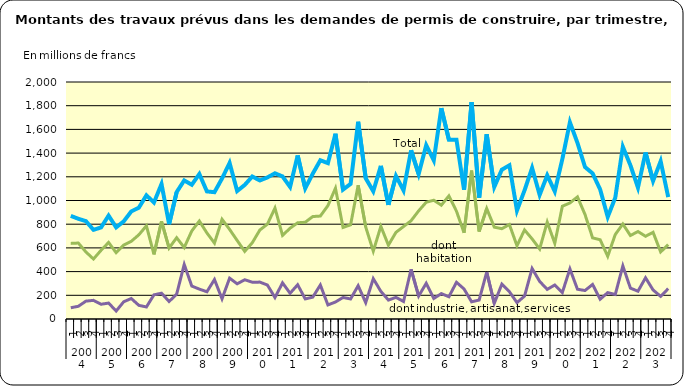
| Category | Series 1 | Series 2 | Series 3 |
|---|---|---|---|
| 0 | 870.242 | 638.031 | 95.061 |
| 1 | 845.656 | 640.955 | 107.34 |
| 2 | 825.743 | 565.77 | 150.775 |
| 3 | 752.519 | 506.261 | 157.418 |
| 4 | 772.617 | 579.57 | 124.318 |
| 5 | 872.366 | 645.941 | 134.593 |
| 6 | 773.108 | 559.38 | 67.48 |
| 7 | 823.981 | 623.879 | 145.563 |
| 8 | 907.879 | 655.638 | 172.873 |
| 9 | 939.543 | 710.541 | 115.256 |
| 10 | 1043.355 | 786.548 | 101.517 |
| 11 | 983.172 | 544.821 | 203.904 |
| 12 | 1139.55 | 823.637 | 217.726 |
| 13 | 800.652 | 598.716 | 147.707 |
| 14 | 1070.917 | 685.929 | 209.934 |
| 15 | 1169.397 | 603.176 | 460.364 |
| 16 | 1132.9 | 743.175 | 277.939 |
| 17 | 1223.557 | 826.96 | 252.245 |
| 18 | 1076.699 | 726.08 | 229.862 |
| 19 | 1070.102 | 640.651 | 333.224 |
| 20 | 1185.684 | 841.14 | 170.224 |
| 21 | 1317.119 | 756.055 | 344.642 |
| 22 | 1079.917 | 662.773 | 296.944 |
| 23 | 1131.164 | 570.731 | 331.21 |
| 24 | 1202.585 | 643.383 | 310.77 |
| 25 | 1169.048 | 750.936 | 311.246 |
| 26 | 1194.768 | 800.467 | 286.719 |
| 27 | 1229.594 | 936.046 | 181.05 |
| 28 | 1203.136 | 705.619 | 304.852 |
| 29 | 1114.431 | 766.27 | 217.028 |
| 30 | 1380.327 | 811.945 | 289.083 |
| 31 | 1102.628 | 816.388 | 169.409 |
| 32 | 1226.569 | 864.557 | 184.336 |
| 33 | 1339.612 | 868.792 | 287.11 |
| 34 | 1315.236 | 956.696 | 118.581 |
| 35 | 1563.818 | 1103.601 | 143.514 |
| 36 | 1092.791 | 772.583 | 181.546 |
| 37 | 1140.429 | 794.867 | 169.112 |
| 38 | 1664.444 | 1129.44 | 280.822 |
| 39 | 1187.642 | 776.111 | 138.121 |
| 40 | 1077.322 | 572.294 | 340.26 |
| 41 | 1292.517 | 782.083 | 233.437 |
| 42 | 963.196 | 623.135 | 159.817 |
| 43 | 1207.243 | 731.475 | 182.681 |
| 44 | 1084.98 | 780.289 | 147.776 |
| 45 | 1423.83 | 829.415 | 419.215 |
| 46 | 1223.037 | 912.764 | 193.608 |
| 47 | 1466.489 | 985.448 | 301.289 |
| 48 | 1338.84 | 1002.108 | 173.246 |
| 49 | 1779.304 | 960.665 | 214.401 |
| 50 | 1513.394 | 1038.921 | 187.701 |
| 51 | 1513.154 | 909.857 | 309.75 |
| 52 | 1090.614 | 728.037 | 253.556 |
| 53 | 1829.678 | 1251.708 | 145.028 |
| 54 | 1024.305 | 738.243 | 160.067 |
| 55 | 1558.733 | 932.105 | 395.807 |
| 56 | 1114.617 | 775.199 | 132.511 |
| 57 | 1260.064 | 762.058 | 293.754 |
| 58 | 1296.895 | 797.081 | 230.372 |
| 59 | 915.568 | 618.093 | 138.258 |
| 60 | 1085.697 | 751.46 | 193.097 |
| 61 | 1275.055 | 676.147 | 426.351 |
| 62 | 1047.458 | 591.22 | 317.374 |
| 63 | 1212.6 | 818.2 | 250.1 |
| 64 | 1076.8 | 638.7 | 286.9 |
| 65 | 1349.7 | 951.6 | 223.7 |
| 66 | 1660.2 | 979.2 | 422.8 |
| 67 | 1486 | 1030.5 | 251.2 |
| 68 | 1282.2 | 881.6 | 240.2 |
| 69 | 1228.7 | 684.6 | 291.7 |
| 70 | 1093.4 | 668.8 | 166.9 |
| 71 | 861.4 | 529.3 | 222.6 |
| 72 | 1024.1 | 713.3 | 207 |
| 73 | 1453.4 | 801.6 | 448 |
| 74 | 1297.2 | 704.5 | 260.5 |
| 75 | 1108.6 | 738.2 | 234.6 |
| 76 | 1405.2 | 698.2 | 347.8 |
| 77 | 1164.9 | 731.5 | 244.8 |
| 78 | 1331.4 | 566 | 191.2 |
| 79 | 1028.6 | 627.8 | 256.2 |